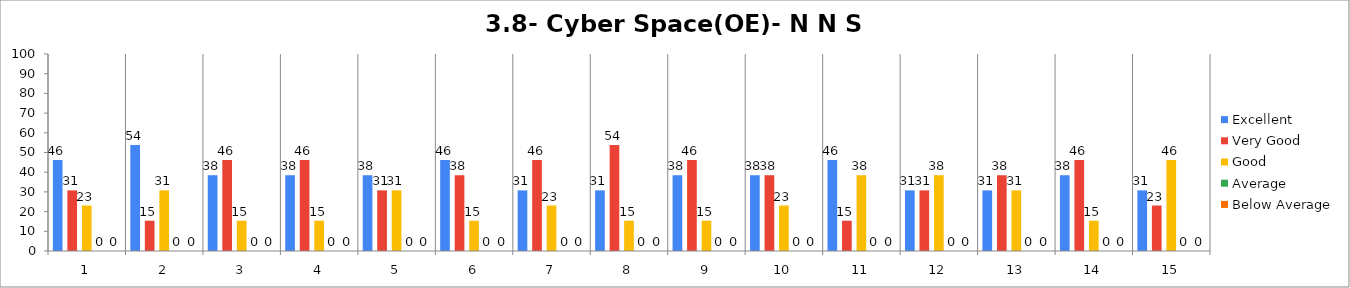
| Category | Excellent | Very Good | Good | Average | Below Average |
|---|---|---|---|---|---|
| 0 | 46.154 | 30.769 | 23.077 | 0 | 0 |
| 1 | 53.846 | 15.385 | 30.769 | 0 | 0 |
| 2 | 38.462 | 46.154 | 15.385 | 0 | 0 |
| 3 | 38.462 | 46.154 | 15.385 | 0 | 0 |
| 4 | 38.462 | 30.769 | 30.769 | 0 | 0 |
| 5 | 46.154 | 38.462 | 15.385 | 0 | 0 |
| 6 | 30.769 | 46.154 | 23.077 | 0 | 0 |
| 7 | 30.769 | 53.846 | 15.385 | 0 | 0 |
| 8 | 38.462 | 46.154 | 15.385 | 0 | 0 |
| 9 | 38.462 | 38.462 | 23.077 | 0 | 0 |
| 10 | 46.154 | 15.385 | 38.462 | 0 | 0 |
| 11 | 30.769 | 30.769 | 38.462 | 0 | 0 |
| 12 | 30.769 | 38.462 | 30.769 | 0 | 0 |
| 13 | 38.462 | 46.154 | 15.385 | 0 | 0 |
| 14 | 30.769 | 23.077 | 46.154 | 0 | 0 |